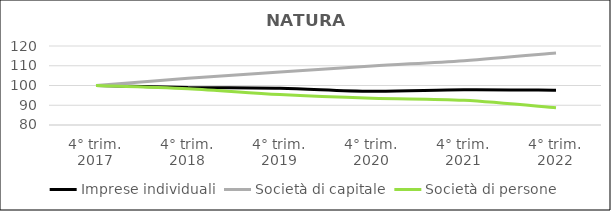
| Category | Imprese individuali | Società di capitale | Società di persone |
|---|---|---|---|
| 4° trim.
2017 | 100 | 100 | 100 |
| 4° trim.
2018 | 99.004 | 103.624 | 98.328 |
| 4° trim.
2019 | 98.581 | 106.8 | 95.384 |
| 4° trim.
2020 | 97.058 | 109.876 | 93.544 |
| 4° trim.
2021 | 97.887 | 112.592 | 92.493 |
| 4° trim.
2022 | 97.648 | 116.469 | 88.675 |